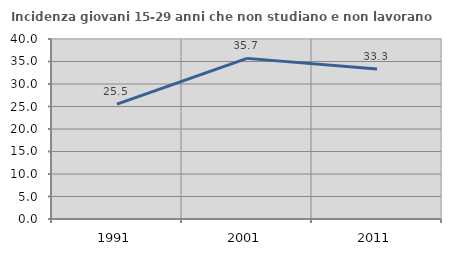
| Category | Incidenza giovani 15-29 anni che non studiano e non lavorano  |
|---|---|
| 1991.0 | 25.517 |
| 2001.0 | 35.694 |
| 2011.0 | 33.333 |